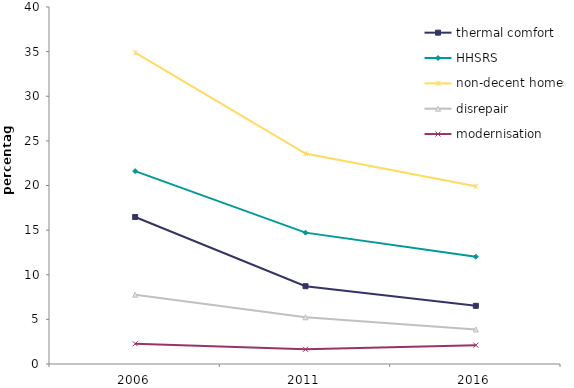
| Category | thermal comfort | HHSRS | non-decent homes | disrepair | modernisation |
|---|---|---|---|---|---|
| 2006.0 | 16.468 | 21.609 | 34.879 | 7.762 | 2.274 |
| 2011.0 | 8.718 | 14.718 | 23.574 | 5.233 | 1.648 |
| 2016.0 | 6.519 | 12.015 | 19.907 | 3.87 | 2.113 |